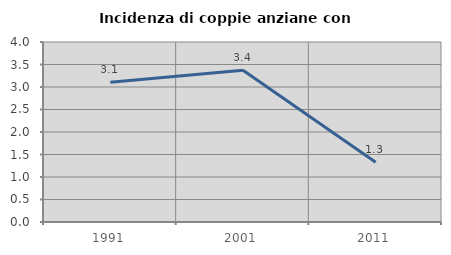
| Category | Incidenza di coppie anziane con figli |
|---|---|
| 1991.0 | 3.106 |
| 2001.0 | 3.371 |
| 2011.0 | 1.327 |